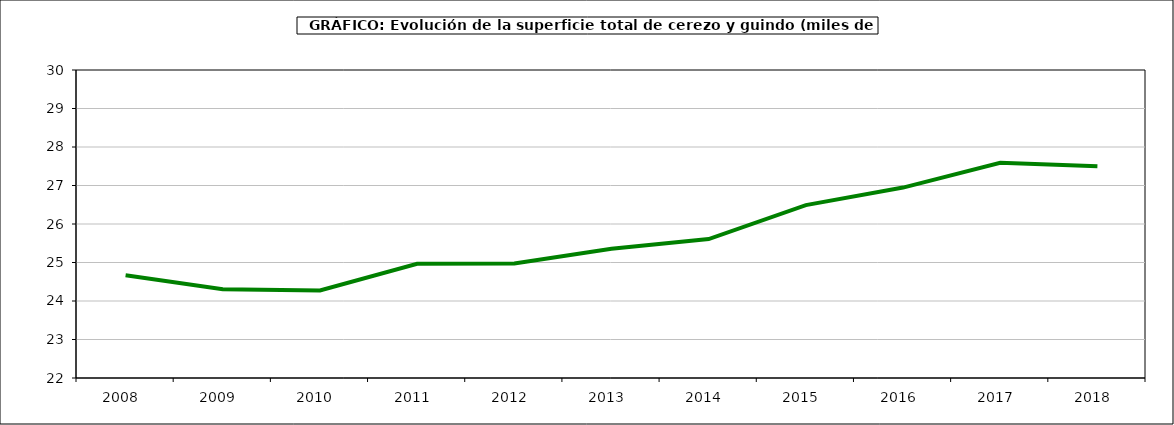
| Category | superficie cerezo y guindo |
|---|---|
| 2008.0 | 24.671 |
| 2009.0 | 24.304 |
| 2010.0 | 24.275 |
| 2011.0 | 24.967 |
| 2012.0 | 24.972 |
| 2013.0 | 25.358 |
| 2014.0 | 25.608 |
| 2015.0 | 26.49 |
| 2016.0 | 26.946 |
| 2017.0 | 27.592 |
| 2018.0 | 27.5 |